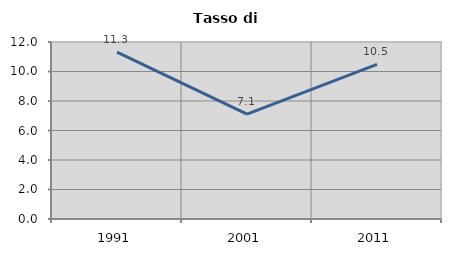
| Category | Tasso di disoccupazione   |
|---|---|
| 1991.0 | 11.317 |
| 2001.0 | 7.108 |
| 2011.0 | 10.477 |